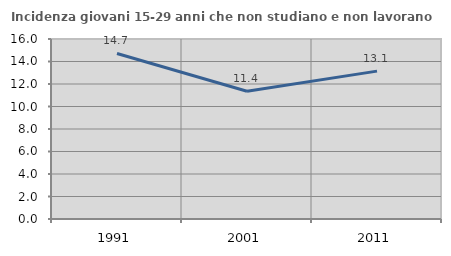
| Category | Incidenza giovani 15-29 anni che non studiano e non lavorano  |
|---|---|
| 1991.0 | 14.715 |
| 2001.0 | 11.36 |
| 2011.0 | 13.145 |